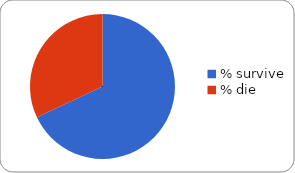
| Category | Series 0 |
|---|---|
| % survive | 0.68 |
| % die | 0.32 |